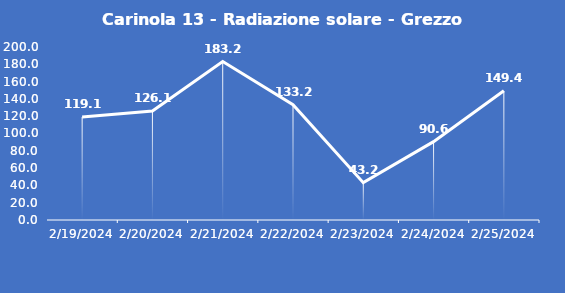
| Category | Carinola 13 - Radiazione solare - Grezzo (W/m2) |
|---|---|
| 2/19/24 | 119.1 |
| 2/20/24 | 126.1 |
| 2/21/24 | 183.2 |
| 2/22/24 | 133.2 |
| 2/23/24 | 43.2 |
| 2/24/24 | 90.6 |
| 2/25/24 | 149.4 |